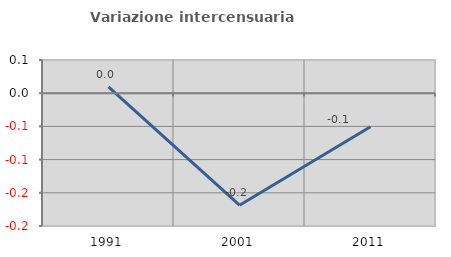
| Category | Variazione intercensuaria annua |
|---|---|
| 1991.0 | 0.009 |
| 2001.0 | -0.169 |
| 2011.0 | -0.05 |